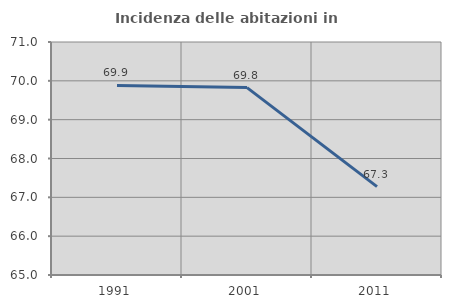
| Category | Incidenza delle abitazioni in proprietà  |
|---|---|
| 1991.0 | 69.881 |
| 2001.0 | 69.826 |
| 2011.0 | 67.276 |